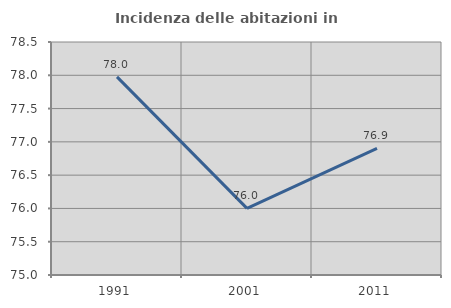
| Category | Incidenza delle abitazioni in proprietà  |
|---|---|
| 1991.0 | 77.976 |
| 2001.0 | 76 |
| 2011.0 | 76.901 |